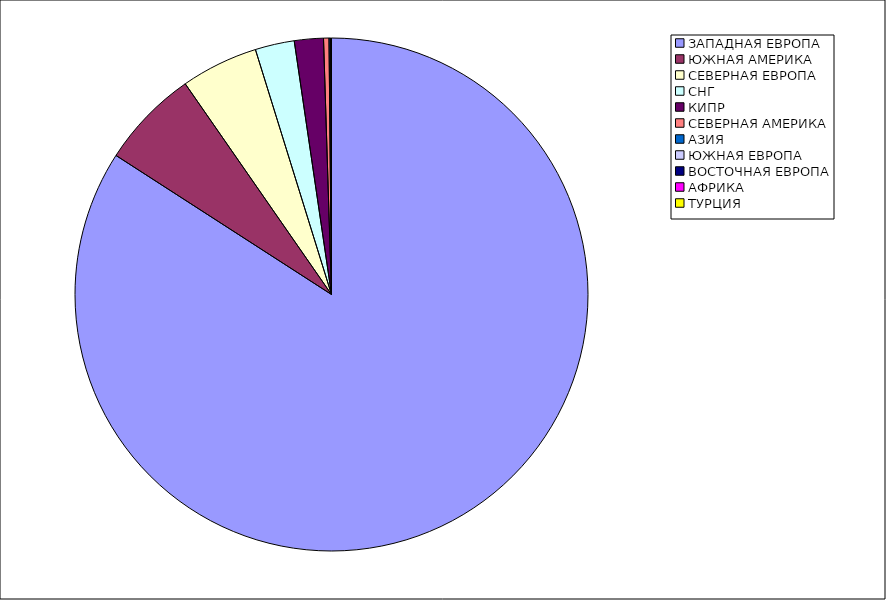
| Category | Оборот |
|---|---|
| ЗАПАДНАЯ ЕВРОПА | 0.841 |
| ЮЖНАЯ АМЕРИКА | 0.062 |
| СЕВЕРНАЯ ЕВРОПА | 0.049 |
| СНГ | 0.025 |
| КИПР | 0.018 |
| СЕВЕРНАЯ АМЕРИКА | 0.003 |
| АЗИЯ | 0.001 |
| ЮЖНАЯ ЕВРОПА | 0 |
| ВОСТОЧНАЯ ЕВРОПА | 0 |
| АФРИКА | 0 |
| ТУРЦИЯ | 0 |